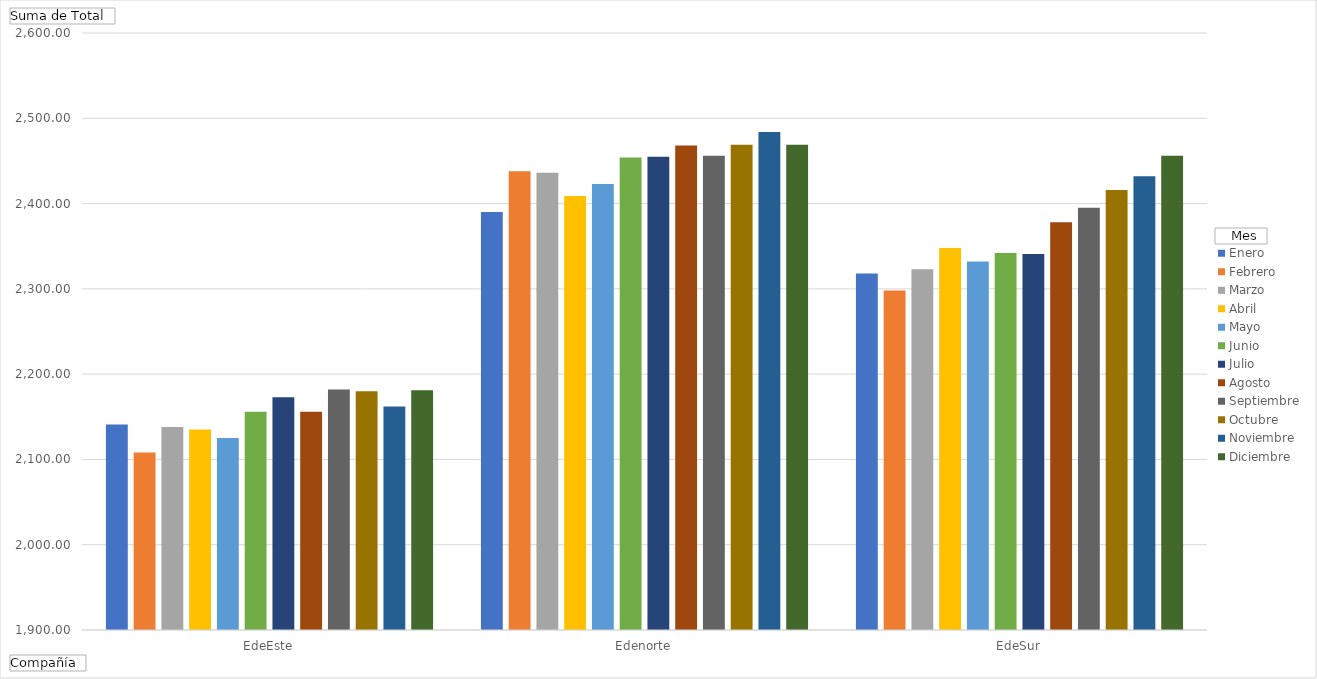
| Category | Enero | Febrero | Marzo | Abril | Mayo | Junio | Julio | Agosto | Septiembre | Octubre | Noviembre | Diciembre |
|---|---|---|---|---|---|---|---|---|---|---|---|---|
| EdeEste | 2141 | 2108 | 2138 | 2135 | 2125 | 2156 | 2173 | 2156 | 2182 | 2180 | 2162 | 2181 |
| Edenorte | 2390 | 2438 | 2436 | 2409 | 2423 | 2454 | 2455 | 2468 | 2456 | 2469 | 2484 | 2469 |
| EdeSur | 2318 | 2298 | 2323 | 2348 | 2332 | 2342 | 2341 | 2378 | 2395 | 2416 | 2432 | 2456 |